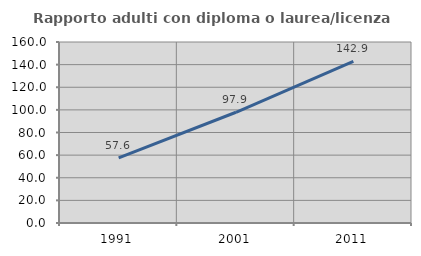
| Category | Rapporto adulti con diploma o laurea/licenza media  |
|---|---|
| 1991.0 | 57.576 |
| 2001.0 | 97.884 |
| 2011.0 | 142.938 |